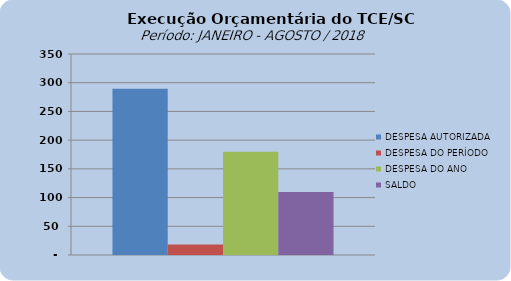
| Category | DESPESA AUTORIZADA | DESPESA DO PERÍODO | DESPESA DO ANO | SALDO |
|---|---|---|---|---|
| 0 | 289671061.86 | 18093346.67 | 179808704.93 | 109862356.93 |